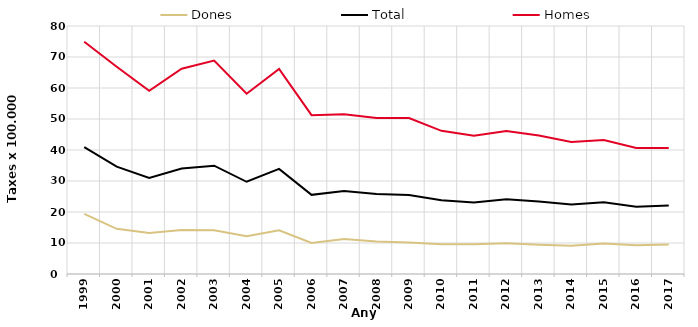
| Category | Dones | Total | Homes |
|---|---|---|---|
| 1999.0 | 19.39 | 40.94 | 74.93 |
| 2000.0 | 14.57 | 34.61 | 66.84 |
| 2001.0 | 13.2 | 31.01 | 59.11 |
| 2002.0 | 14.18 | 34.03 | 66.22 |
| 2003.0 | 14.1 | 34.95 | 68.87 |
| 2004.0 | 12.16 | 29.75 | 58.14 |
| 2005.0 | 14.08 | 33.91 | 66.15 |
| 2006.0 | 10.01 | 25.53 | 51.25 |
| 2007.0 | 11.3 | 26.74 | 51.54 |
| 2008.0 | 10.52 | 25.79 | 50.36 |
| 2009.0 | 10.13 | 25.5 | 50.32 |
| 2010.0 | 9.57 | 23.78 | 46.18 |
| 2011.0 | 9.58 | 23.1 | 44.62 |
| 2012.0 | 9.91 | 24.11 | 46.14 |
| 2013.0 | 9.47 | 23.41 | 44.66 |
| 2014.0 | 9.09 | 22.43 | 42.56 |
| 2015.0 | 9.81 | 23.14 | 43.23 |
| 2016.0 | 9.26 | 21.71 | 40.62 |
| 2017.0 | 9.55 | 22.07 | 40.67 |